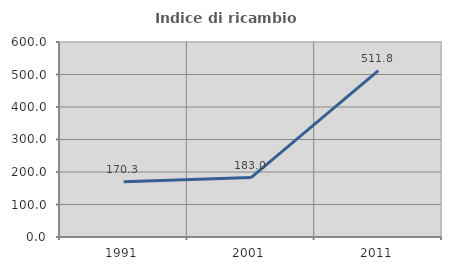
| Category | Indice di ricambio occupazionale  |
|---|---|
| 1991.0 | 170.297 |
| 2001.0 | 182.955 |
| 2011.0 | 511.765 |